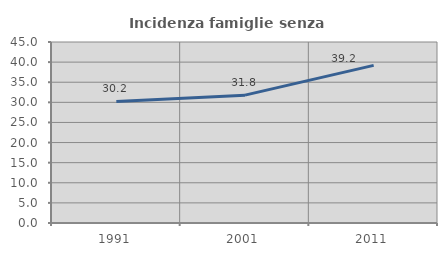
| Category | Incidenza famiglie senza nuclei |
|---|---|
| 1991.0 | 30.216 |
| 2001.0 | 31.784 |
| 2011.0 | 39.194 |